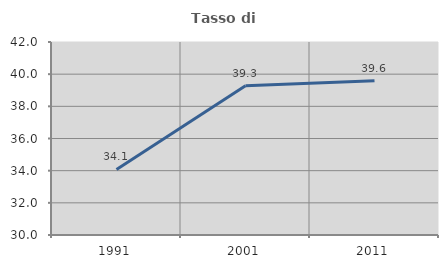
| Category | Tasso di occupazione   |
|---|---|
| 1991.0 | 34.077 |
| 2001.0 | 39.276 |
| 2011.0 | 39.596 |